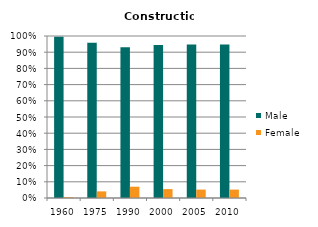
| Category | Male | Female |
|---|---|---|
| 1960.0 | 0.995 | 0.005 |
| 1975.0 | 0.959 | 0.041 |
| 1990.0 | 0.93 | 0.07 |
| 2000.0 | 0.945 | 0.055 |
| 2005.0 | 0.948 | 0.052 |
| 2010.0 | 0.948 | 0.052 |